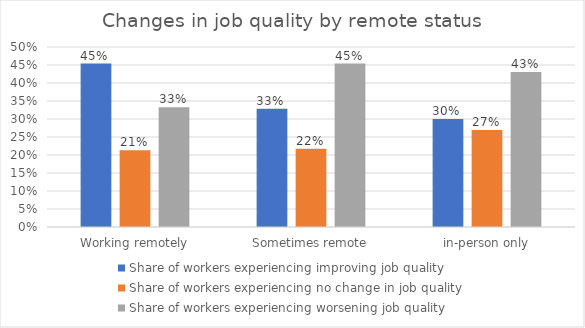
| Category | Share of workers experiencing improving job quality | Share of workers experiencing no change in job quality | Share of workers experiencing worsening job quality |
|---|---|---|---|
| Working remotely | 0.454 | 0.213 | 0.333 |
| Sometimes remote | 0.329 | 0.218 | 0.454 |
| in-person only | 0.3 | 0.269 | 0.431 |